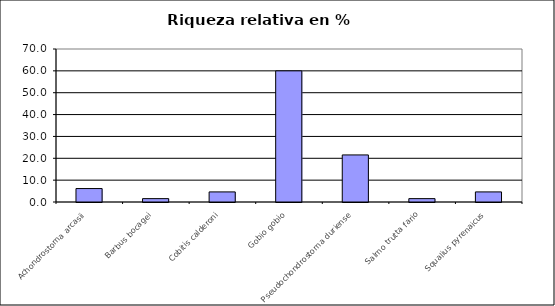
| Category | Series 0 |
|---|---|
| Achondrostoma arcasii | 6.154 |
| Barbus bocagei | 1.538 |
| Cobitis calderoni | 4.615 |
| Gobio gobio | 60 |
| Pseudochondrostoma duriense | 21.538 |
| Salmo trutta fario | 1.538 |
| Squalius pyrenaicus | 4.615 |